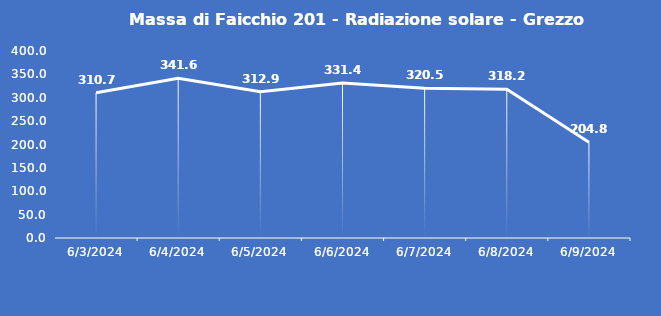
| Category | Massa di Faicchio 201 - Radiazione solare - Grezzo (W/m2) |
|---|---|
| 6/3/24 | 310.7 |
| 6/4/24 | 341.6 |
| 6/5/24 | 312.9 |
| 6/6/24 | 331.4 |
| 6/7/24 | 320.5 |
| 6/8/24 | 318.2 |
| 6/9/24 | 204.8 |